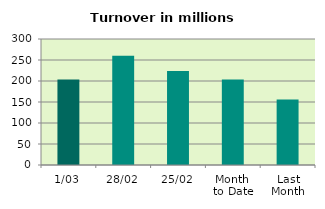
| Category | Series 0 |
|---|---|
| 1/03 | 203.779 |
| 28/02 | 260.15 |
| 25/02 | 223.552 |
| Month 
to Date | 203.779 |
| Last
Month | 156.222 |